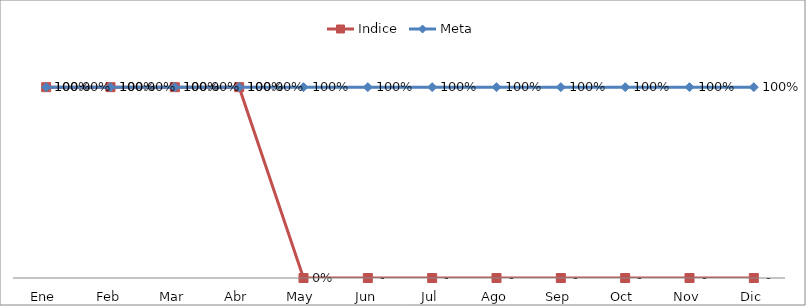
| Category | Indice | Meta |
|---|---|---|
| Ene | 1 | 1 |
| Feb | 1 | 1 |
| Mar | 1 | 1 |
| Abr | 1 | 1 |
| May | 0 | 1 |
| Jun | 0 | 1 |
| Jul | 0 | 1 |
| Ago | 0 | 1 |
| Sep | 0 | 1 |
| Oct | 0 | 1 |
| Nov | 0 | 1 |
| Dic | 0 | 1 |